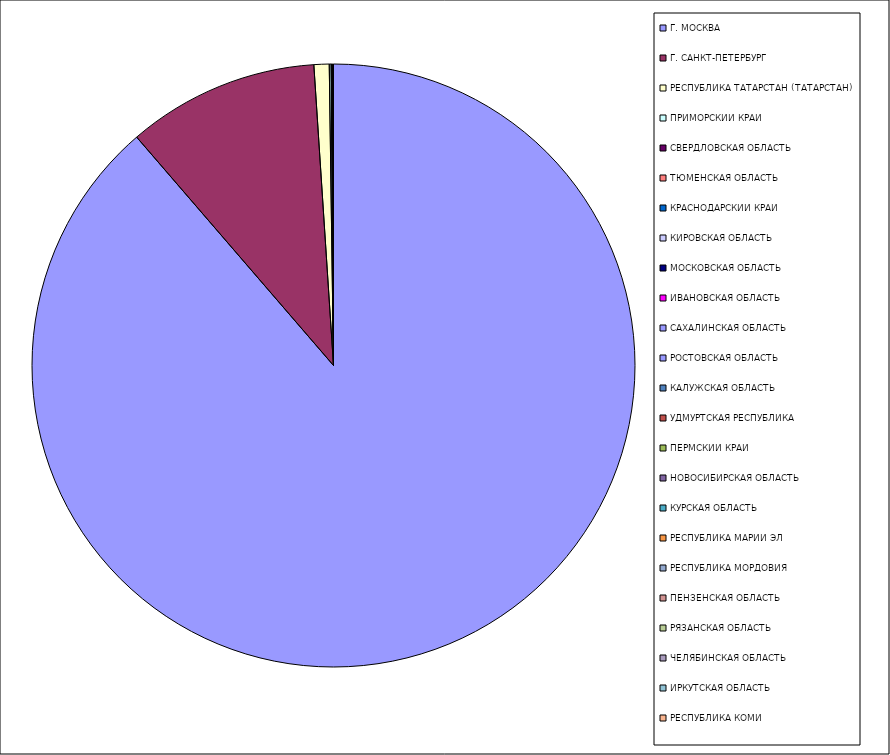
| Category | Оборот |
|---|---|
| Г. МОСКВА | 88.675 |
| Г. САНКТ-ПЕТЕРБУРГ | 10.282 |
| РЕСПУБЛИКА ТАТАРСТАН (ТАТАРСТАН) | 0.815 |
| ПРИМОРСКИЙ КРАЙ | 0.098 |
| СВЕРДЛОВСКАЯ ОБЛАСТЬ | 0.04 |
| ТЮМЕНСКАЯ ОБЛАСТЬ | 0.022 |
| КРАСНОДАРСКИЙ КРАЙ | 0.01 |
| КИРОВСКАЯ ОБЛАСТЬ | 0.009 |
| МОСКОВСКАЯ ОБЛАСТЬ | 0.008 |
| ИВАНОВСКАЯ ОБЛАСТЬ | 0.005 |
| САХАЛИНСКАЯ ОБЛАСТЬ | 0.005 |
| РОСТОВСКАЯ ОБЛАСТЬ | 0.004 |
| КАЛУЖСКАЯ ОБЛАСТЬ | 0.004 |
| УДМУРТСКАЯ РЕСПУБЛИКА | 0.004 |
| ПЕРМСКИЙ КРАЙ | 0.004 |
| НОВОСИБИРСКАЯ ОБЛАСТЬ | 0.004 |
| КУРСКАЯ ОБЛАСТЬ | 0.002 |
| РЕСПУБЛИКА МАРИЙ ЭЛ | 0.002 |
| РЕСПУБЛИКА МОРДОВИЯ | 0.001 |
| ПЕНЗЕНСКАЯ ОБЛАСТЬ | 0.001 |
| РЯЗАНСКАЯ ОБЛАСТЬ | 0.001 |
| ЧЕЛЯБИНСКАЯ ОБЛАСТЬ | 0.001 |
| ИРКУТСКАЯ ОБЛАСТЬ | 0.001 |
| РЕСПУБЛИКА КОМИ | 0 |